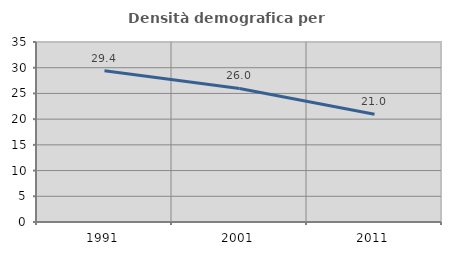
| Category | Densità demografica |
|---|---|
| 1991.0 | 29.4 |
| 2001.0 | 25.96 |
| 2011.0 | 20.955 |